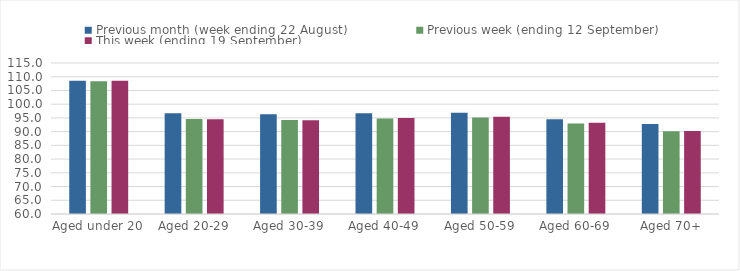
| Category | Previous month (week ending 22 August) | Previous week (ending 12 September) | This week (ending 19 September) |
|---|---|---|---|
| Aged under 20 | 108.53 | 108.35 | 108.56 |
| Aged 20-29 | 96.68 | 94.62 | 94.52 |
| Aged 30-39 | 96.36 | 94.21 | 94.15 |
| Aged 40-49 | 96.7 | 94.82 | 94.93 |
| Aged 50-59 | 96.88 | 95.11 | 95.46 |
| Aged 60-69 | 94.48 | 93 | 93.21 |
| Aged 70+ | 92.81 | 90.1 | 90.21 |